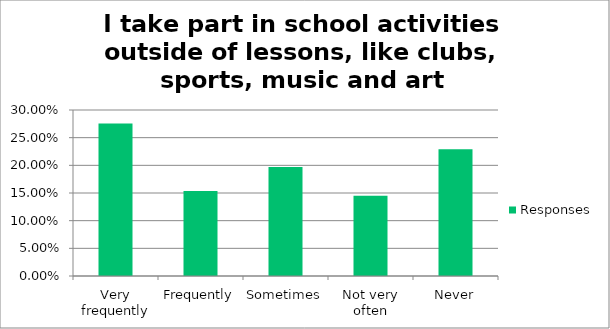
| Category | Responses |
|---|---|
| Very frequently | 0.276 |
| Frequently | 0.154 |
| Sometimes | 0.197 |
| Not very often | 0.145 |
| Never | 0.229 |